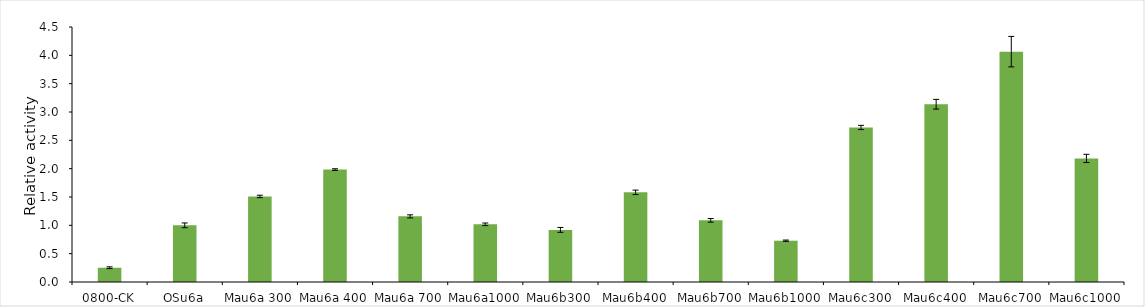
| Category | Series 0 |
|---|---|
| 0800-CK | 0.252 |
| OSu6a | 1 |
| Mau6a 300 | 1.51 |
| Mau6a 400 | 1.984 |
| Mau6a 700 | 1.158 |
| Mau6a1000 | 1.018 |
| Mau6b300 | 0.92 |
| Mau6b400 | 1.582 |
| Mau6b700 | 1.088 |
| Mau6b1000 | 0.729 |
| Mau6c300 | 2.727 |
| Mau6c400 | 3.137 |
| Mau6c700 | 4.065 |
| Mau6c1000 | 2.181 |